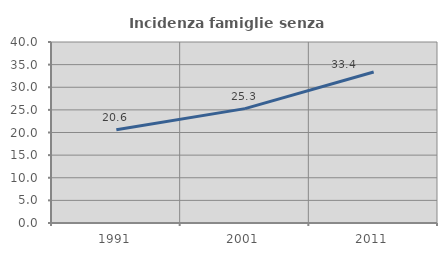
| Category | Incidenza famiglie senza nuclei |
|---|---|
| 1991.0 | 20.618 |
| 2001.0 | 25.278 |
| 2011.0 | 33.378 |